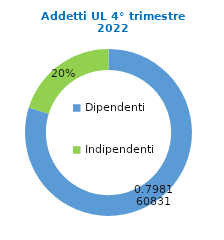
| Category | Series 0 |
|---|---|
| Dipendenti | 86709 |
| Indipendenti | 21927 |